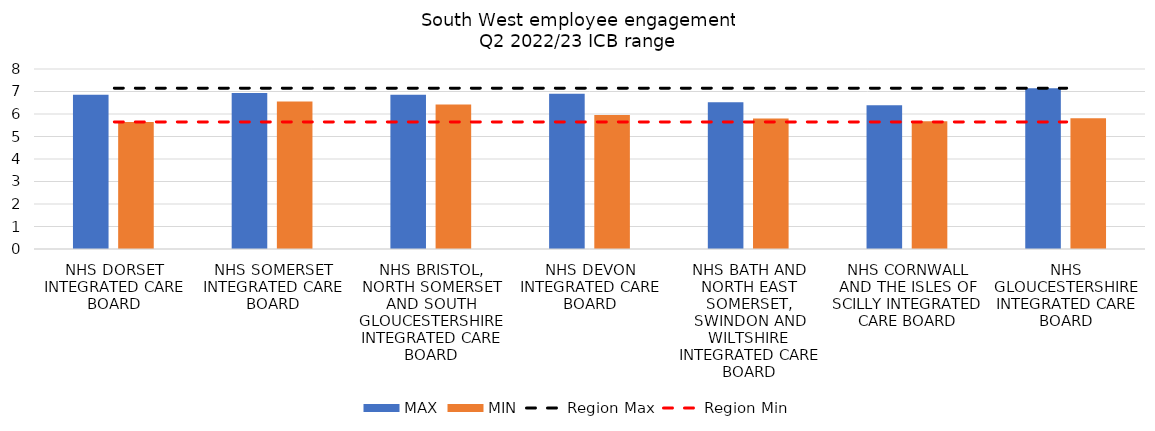
| Category | MAX | MIN |
|---|---|---|
| NHS DORSET INTEGRATED CARE BOARD | 6.854 | 5.649 |
| NHS SOMERSET INTEGRATED CARE BOARD | 6.934 | 6.557 |
| NHS BRISTOL, NORTH SOMERSET AND SOUTH GLOUCESTERSHIRE INTEGRATED CARE BOARD | 6.858 | 6.418 |
| NHS DEVON INTEGRATED CARE BOARD | 6.9 | 5.951 |
| NHS BATH AND NORTH EAST SOMERSET, SWINDON AND WILTSHIRE INTEGRATED CARE BOARD | 6.519 | 5.797 |
| NHS CORNWALL AND THE ISLES OF SCILLY INTEGRATED CARE BOARD | 6.387 | 5.677 |
| NHS GLOUCESTERSHIRE INTEGRATED CARE BOARD | 7.15 | 5.812 |